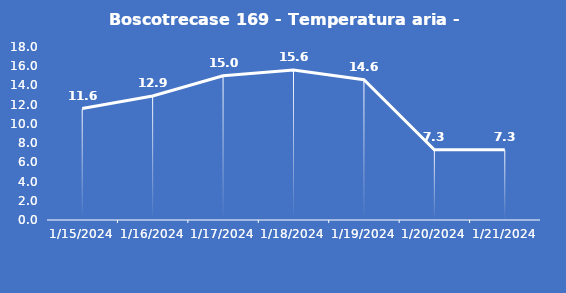
| Category | Boscotrecase 169 - Temperatura aria - Grezzo (°C) |
|---|---|
| 1/15/24 | 11.6 |
| 1/16/24 | 12.9 |
| 1/17/24 | 15 |
| 1/18/24 | 15.6 |
| 1/19/24 | 14.6 |
| 1/20/24 | 7.3 |
| 1/21/24 | 7.3 |